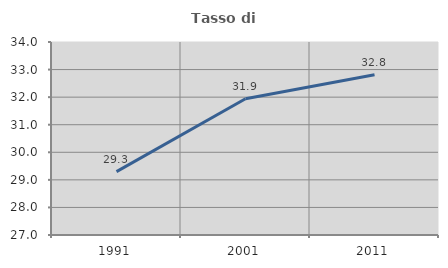
| Category | Tasso di occupazione   |
|---|---|
| 1991.0 | 29.3 |
| 2001.0 | 31.942 |
| 2011.0 | 32.812 |